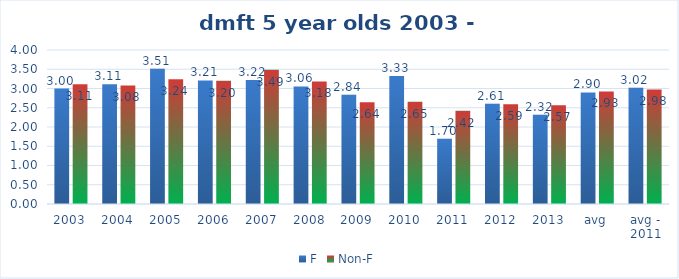
| Category | F | Non-F |
|---|---|---|
| 2003 | 3 | 3.11 |
| 2004 | 3.11 | 3.08 |
| 2005 | 3.513 | 3.24 |
| 2006 | 3.21 | 3.2 |
| 2007 | 3.218 | 3.488 |
| 2008 | 3.055 | 3.182 |
| 2009 | 2.837 | 2.64 |
| 2010 | 3.325 | 2.655 |
| 2011 | 1.696 | 2.423 |
| 2012 | 2.606 | 2.591 |
| 2013 | 2.32 | 2.568 |
| avg | 2.899 | 2.925 |
| avg - 2011 | 3.019 | 2.975 |